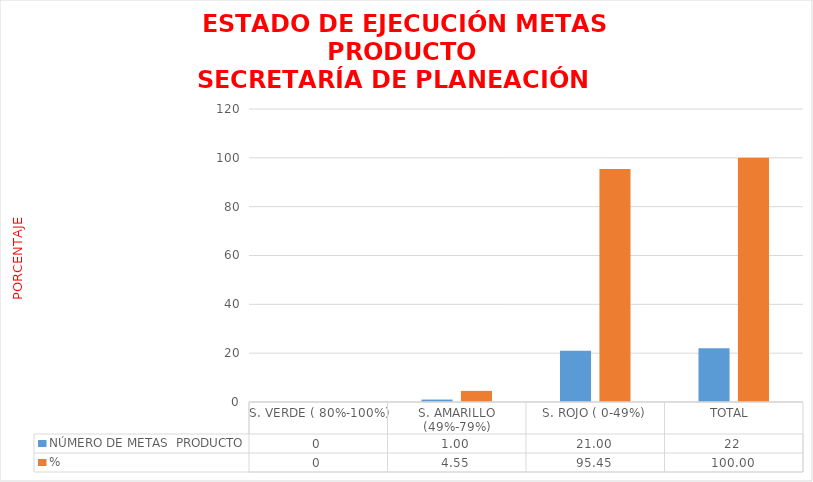
| Category | NÚMERO DE METAS  PRODUCTO  | % |
|---|---|---|
| S. VERDE ( 80%-100%)  | 0 | 0 |
| S. AMARILLO (49%-79%) | 1 | 4.545 |
| S. ROJO ( 0-49%) | 21 | 95.455 |
| TOTAL  | 22 | 100 |